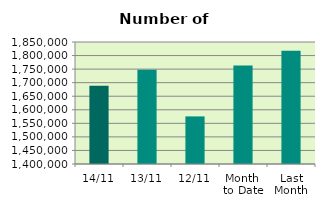
| Category | Series 0 |
|---|---|
| 14/11 | 1689048 |
| 13/11 | 1747994 |
| 12/11 | 1575542 |
| Month 
to Date | 1763440 |
| Last
Month | 1817802.609 |